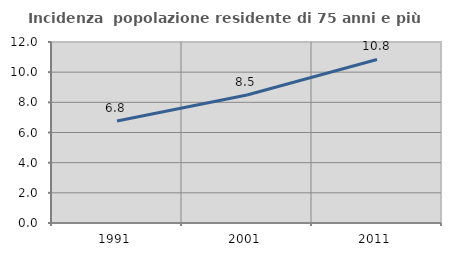
| Category | Incidenza  popolazione residente di 75 anni e più |
|---|---|
| 1991.0 | 6.761 |
| 2001.0 | 8.488 |
| 2011.0 | 10.841 |